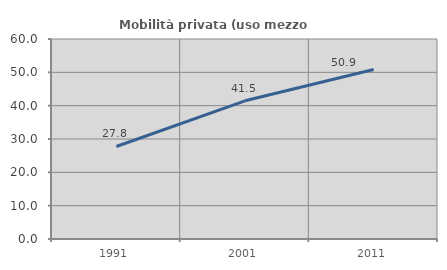
| Category | Mobilità privata (uso mezzo privato) |
|---|---|
| 1991.0 | 27.761 |
| 2001.0 | 41.463 |
| 2011.0 | 50.862 |